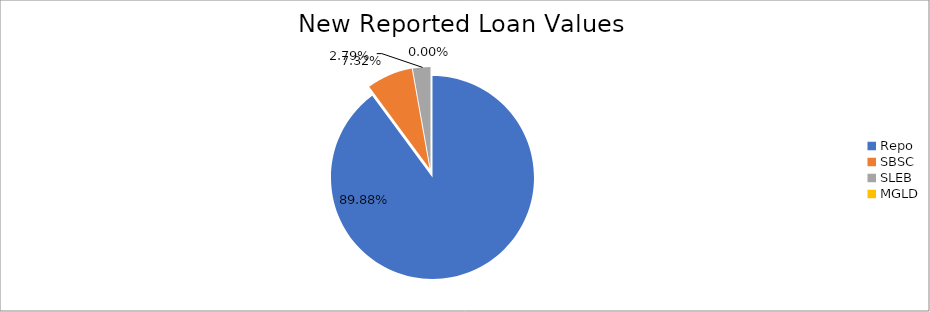
| Category | Series 0 |
|---|---|
| Repo | 12937840.166 |
| SBSC | 1054045.588 |
| SLEB | 402271.626 |
| MGLD | 694.7 |